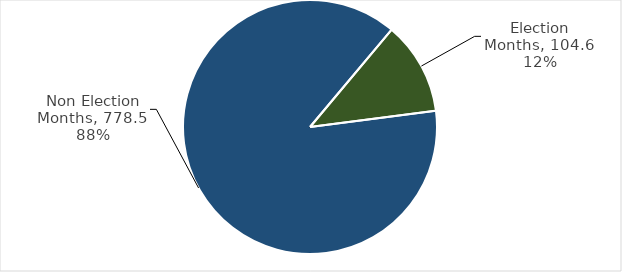
| Category | Total Grants |
|---|---|
| Election Months | 104.558 |
| Non Election Months | 778.486 |